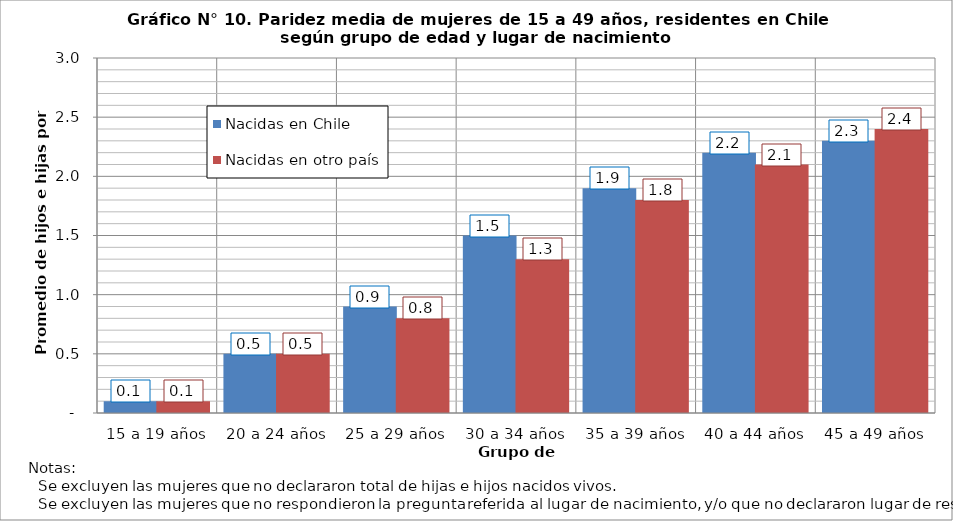
| Category | Nacidas en Chile | Nacidas en otro país |
|---|---|---|
| 15 a 19 años | 0.1 | 0.1 |
| 20 a 24 años | 0.5 | 0.5 |
| 25 a 29 años | 0.9 | 0.8 |
| 30 a 34 años | 1.5 | 1.3 |
| 35 a 39 años | 1.9 | 1.8 |
| 40 a 44 años | 2.2 | 2.1 |
| 45 a 49 años | 2.3 | 2.4 |